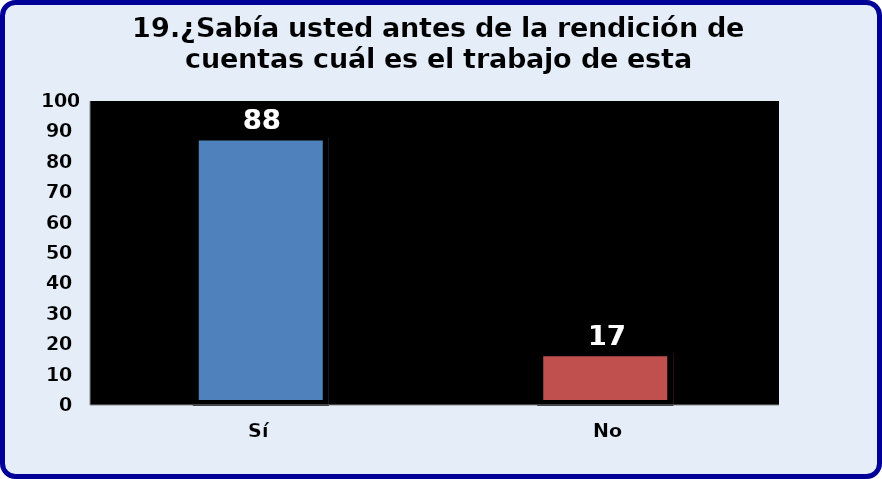
| Category | Series 0 |
|---|---|
| Sí | 88 |
| No | 17 |